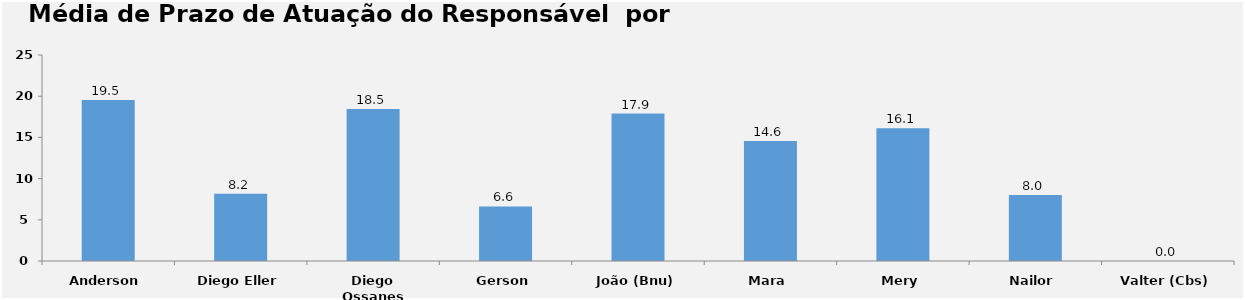
| Category | Series 0 |
|---|---|
| Anderson | 19.533 |
| Diego Eller | 8.161 |
| Diego Ossanes | 18.455 |
| Gerson | 6.625 |
| João (Bnu) | 17.897 |
| Mara | 14.571 |
| Mery | 16.125 |
| Nailor | 8 |
| Valter (Cbs) | 0 |